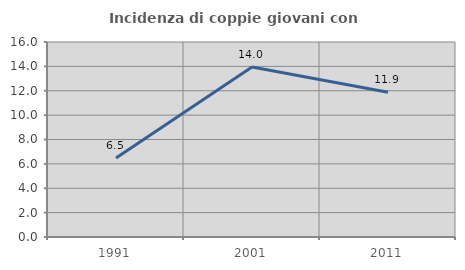
| Category | Incidenza di coppie giovani con figli |
|---|---|
| 1991.0 | 6.481 |
| 2001.0 | 13.953 |
| 2011.0 | 11.875 |